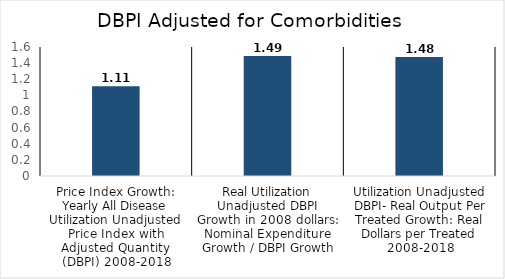
| Category | All Disease |
|---|---|
| Price Index Growth: Yearly All Disease Utilization Unadjusted Price Index with Adjusted Quantity (DBPI) 2008-2018 | 1.114 |
| Real Utilization Unadjusted DBPI Growth in 2008 dollars: Nominal Expenditure Growth / DBPI Growth | 1.488 |
| Utilization Unadjusted DBPI- Real Output Per Treated Growth: Real Dollars per Treated 2008-2018 | 1.476 |